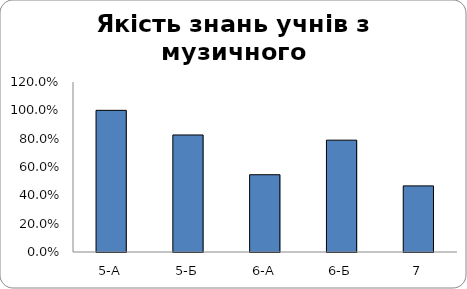
| Category | Series 0 |
|---|---|
| 5-А | 1 |
| 5-Б | 0.826 |
| 6-А | 0.545 |
| 6-Б | 0.789 |
| 7 | 0.467 |